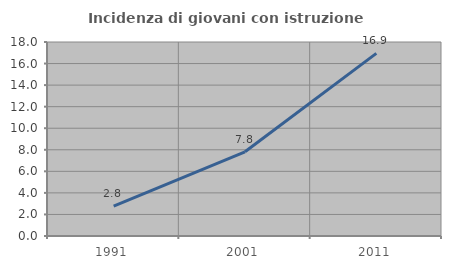
| Category | Incidenza di giovani con istruzione universitaria |
|---|---|
| 1991.0 | 2.778 |
| 2001.0 | 7.812 |
| 2011.0 | 16.944 |